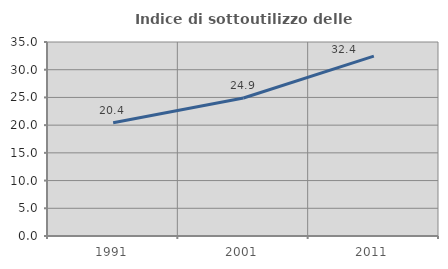
| Category | Indice di sottoutilizzo delle abitazioni  |
|---|---|
| 1991.0 | 20.415 |
| 2001.0 | 24.905 |
| 2011.0 | 32.44 |